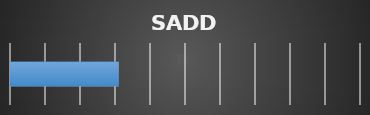
| Category | Series 0 |
|---|---|
| 0 | 31.111 |